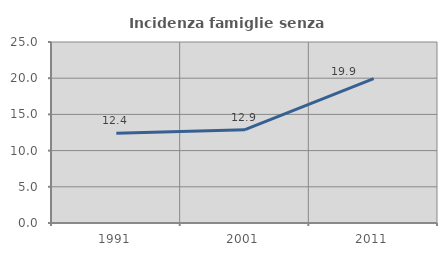
| Category | Incidenza famiglie senza nuclei |
|---|---|
| 1991.0 | 12.405 |
| 2001.0 | 12.896 |
| 2011.0 | 19.944 |